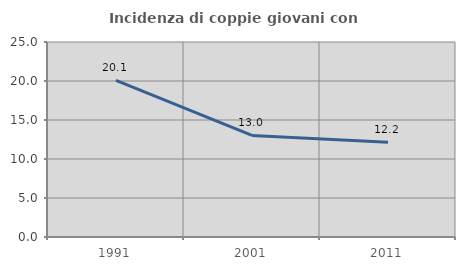
| Category | Incidenza di coppie giovani con figli |
|---|---|
| 1991.0 | 20.073 |
| 2001.0 | 13.026 |
| 2011.0 | 12.16 |